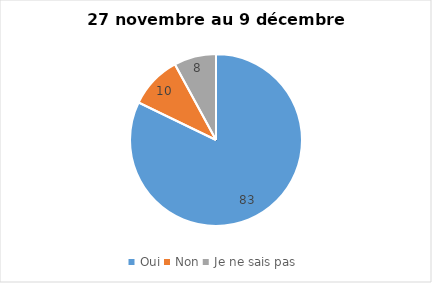
| Category | Series 0 |
|---|---|
| Oui | 83 |
| Non | 10 |
| Je ne sais pas | 8 |